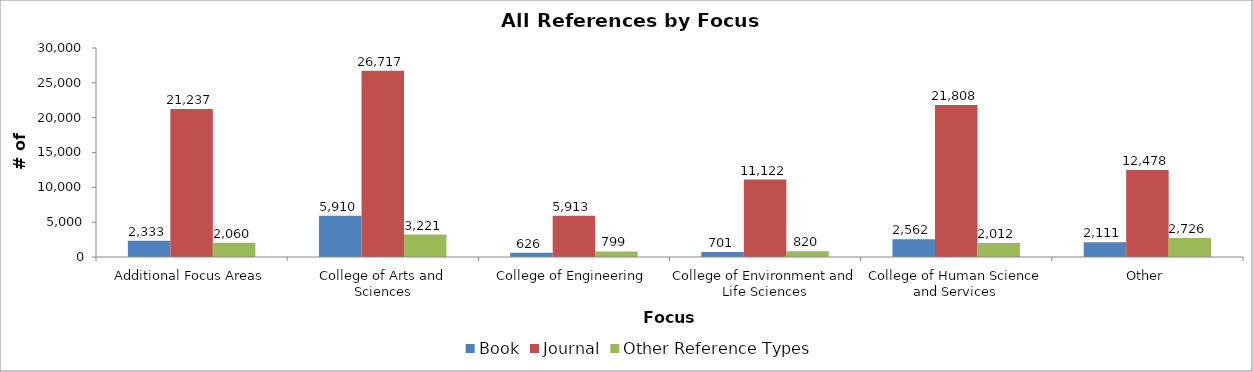
| Category | Book | Journal | Other Reference Types |
|---|---|---|---|
| Additional Focus Areas | 2333 | 21237 | 2060 |
| College of Arts and Sciences | 5910 | 26717 | 3221 |
| College of Engineering | 626 | 5913 | 799 |
| College of Environment and Life Sciences | 701 | 11122 | 820 |
| College of Human Science and Services | 2562 | 21808 | 2012 |
| Other | 2111 | 12478 | 2726 |